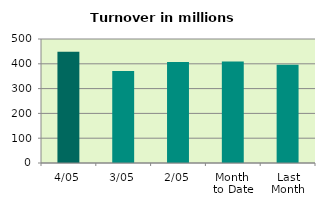
| Category | Series 0 |
|---|---|
| 4/05 | 448.59 |
| 3/05 | 371.153 |
| 2/05 | 406.843 |
| Month 
to Date | 408.862 |
| Last
Month | 396.429 |